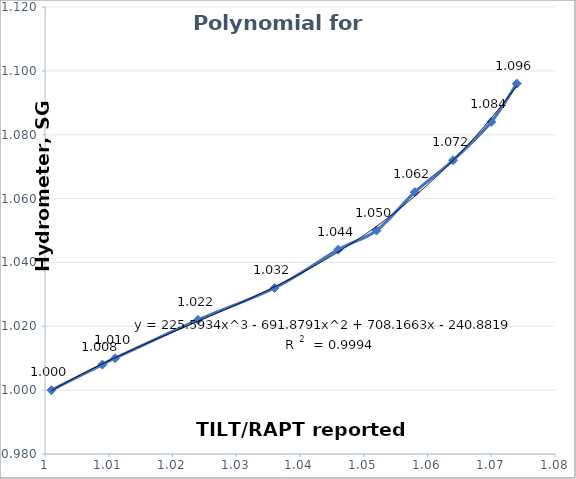
| Category | Series 0 |
|---|---|
| 1.001 | 1 |
| 1.009 | 1.008 |
| 1.011 | 1.01 |
| 1.024 | 1.022 |
| 1.036 | 1.032 |
| 1.046 | 1.044 |
| 1.052 | 1.05 |
| 1.058 | 1.062 |
| 1.064 | 1.072 |
| 1.07 | 1.084 |
| 1.074 | 1.096 |